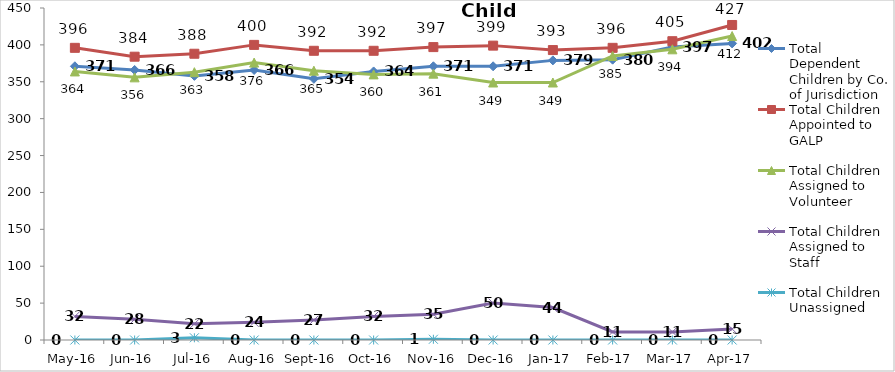
| Category | Total Dependent Children by Co. of Jurisdiction | Total Children Appointed to GALP | Total Children Assigned to Volunteer | Total Children Assigned to Staff | Total Children Unassigned |
|---|---|---|---|---|---|
| May-16 | 371 | 396 | 364 | 32 | 0 |
| Jun-16 | 366 | 384 | 356 | 28 | 0 |
| Jul-16 | 358 | 388 | 363 | 22 | 3 |
| Aug-16 | 366 | 400 | 376 | 24 | 0 |
| Sep-16 | 354 | 392 | 365 | 27 | 0 |
| Oct-16 | 364 | 392 | 360 | 32 | 0 |
| Nov-16 | 371 | 397 | 361 | 35 | 1 |
| Dec-16 | 371 | 399 | 349 | 50 | 0 |
| Jan-17 | 379 | 393 | 349 | 44 | 0 |
| Feb-17 | 380 | 396 | 385 | 11 | 0 |
| Mar-17 | 397 | 405 | 394 | 11 | 0 |
| Apr-17 | 402 | 427 | 412 | 15 | 0 |